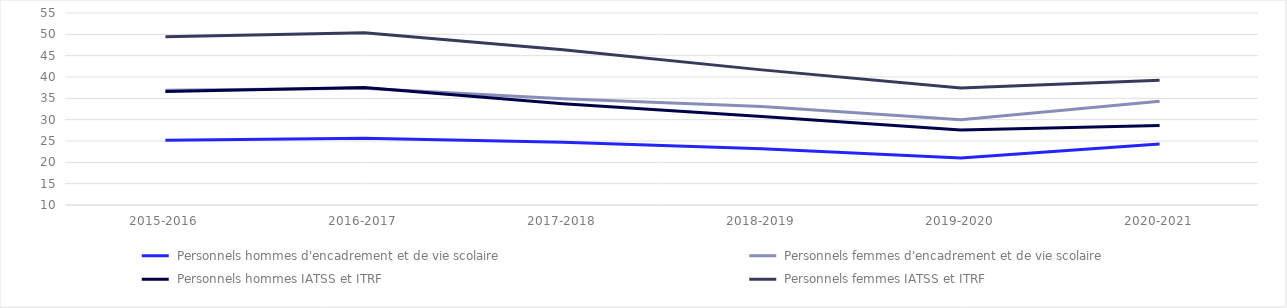
| Category |  Personnels hommes d'encadrement et de vie scolaire |  Personnels femmes d'encadrement et de vie scolaire |  Personnels hommes IATSS et ITRF |  Personnels femmes IATSS et ITRF |
|---|---|---|---|---|
| 2015-2016 | 25.18 | 36.9 | 36.58 | 49.46 |
| 2016-2017 | 25.63 | 37.34 | 37.54 | 50.37 |
| 2017-2018 | 24.73 | 34.88 | 33.73 | 46.36 |
| 2018-2019 | 23.18 | 33.07 | 30.73 | 41.67 |
| 2019-2020 | 21.03 | 30 | 27.56 | 37.44 |
| 2020-2021 | 24.27 | 34.34 | 28.61 | 39.25 |